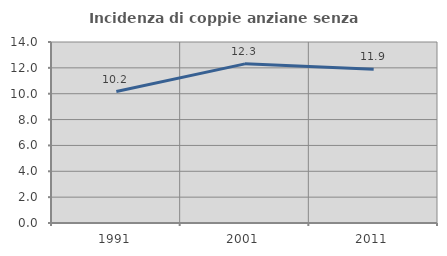
| Category | Incidenza di coppie anziane senza figli  |
|---|---|
| 1991.0 | 10.168 |
| 2001.0 | 12.309 |
| 2011.0 | 11.898 |